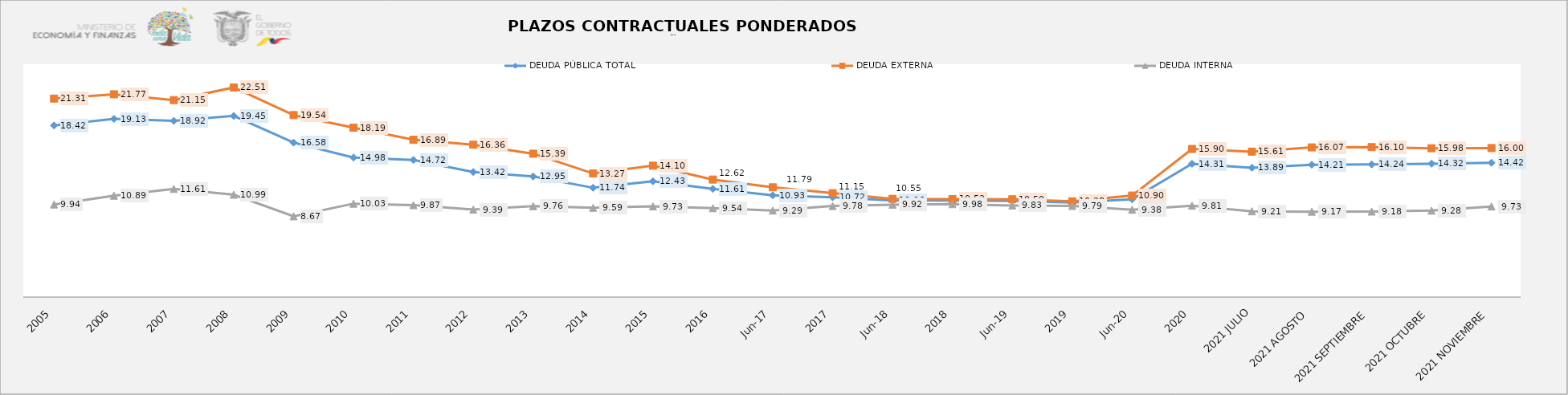
| Category | DEUDA PÚBLICA TOTAL | DEUDA EXTERNA  | DEUDA INTERNA |
|---|---|---|---|
| 2005 | 18.42 | 21.31 | 9.94 |
| 2006 | 19.13 | 21.77 | 10.89 |
| 2007 | 18.92 | 21.15 | 11.61 |
| 2008 | 19.45 | 22.505 | 10.99 |
| 2009 | 16.58 | 19.536 | 8.67 |
| 2010 | 14.98 | 18.188 | 10.03 |
| 2011 | 14.717 | 16.89 | 9.87 |
| 2012 | 13.423 | 16.356 | 9.39 |
| 2013 | 12.946 | 15.393 | 9.76 |
| 2014 | 11.737 | 13.27 | 9.59 |
| 2015 | 12.43 | 14.105 | 9.734 |
| 2016 | 11.611 | 12.616 | 9.541 |
| jun-17 | 10.928 | 11.786 | 9.294 |
| 2017 | 10.717 | 11.155 | 9.776 |
| jun-18 | 10.364 | 10.547 | 9.919 |
| 2018 | 10.371 | 10.522 | 9.976 |
| jun-19 | 10.321 | 10.498 | 9.835 |
| 2019 | 10.156 | 10.284 | 9.786 |
| jun-20 | 10.488 | 10.898 | 9.379 |
| 2020 | 14.309 | 15.905 | 9.812 |
| 2021 JULIO | 13.89 | 15.614 | 9.21 |
| 2021 AGOSTO | 14.21 | 16.07 | 9.17 |
| 2021 SEPTIEMBRE | 14.24 | 16.1 | 9.18 |
| 2021 OCTUBRE | 14.32 | 15.98 | 9.28 |
| 2021 NOVIEMBRE | 14.42 | 16 | 9.73 |